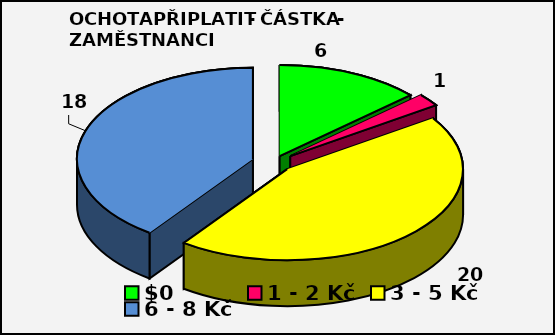
| Category | Series 0 |
|---|---|
| 0 Kč | 6 |
| 1 - 2 Kč | 1 |
| 3 - 5 Kč | 20 |
| 6 - 8 Kč | 18 |